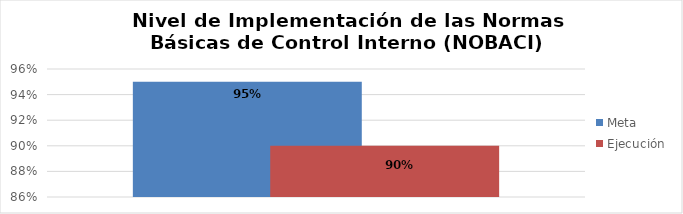
| Category | Meta | Ejecución |
|---|---|---|
| 0 | 0.95 | 0.9 |